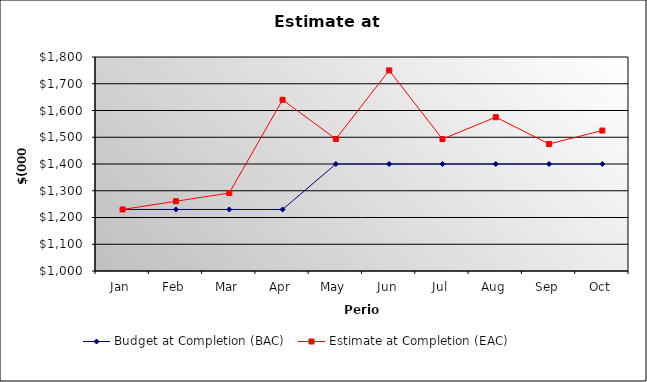
| Category | Budget at Completion (BAC) | Estimate at Completion (EAC) |
|---|---|---|
| Jan | 1230 | 1230 |
| Feb | 1230 | 1260.75 |
| Mar | 1230 | 1291.5 |
| Apr | 1230 | 1640 |
| May | 1400 | 1493.333 |
| Jun | 1400 | 1750 |
| Jul | 1400 | 1493.333 |
| Aug | 1400 | 1575 |
| Sep | 1400 | 1475 |
| Oct | 1400 | 1525 |